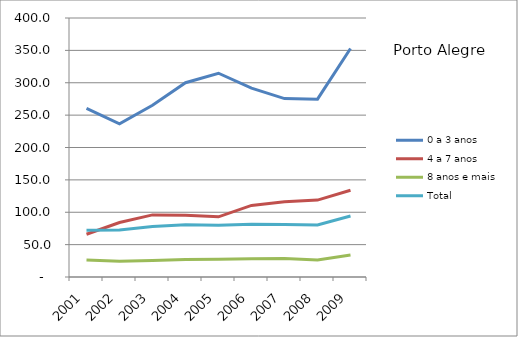
| Category | 0 a 3 anos | 4 a 7 anos | 8 anos e mais | Total |
|---|---|---|---|---|
| 2001.0 | 260.4 | 66 | 26.4 | 72.2 |
| 2002.0 | 236.7 | 84.2 | 24.2 | 72.5 |
| 2003.0 | 265.2 | 95.9 | 25.6 | 77.9 |
| 2004.0 | 300.1 | 95.5 | 27 | 80.6 |
| 2005.0 | 314.7 | 92.9 | 27.3 | 79.8 |
| 2006.0 | 291.6 | 110.5 | 28.3 | 81.3 |
| 2007.0 | 275.5 | 116.1 | 28.6 | 81.2 |
| 2008.0 | 274.7 | 118.8 | 26.4 | 80.5 |
| 2009.0 | 352.9 | 133.9 | 34 | 94.3 |